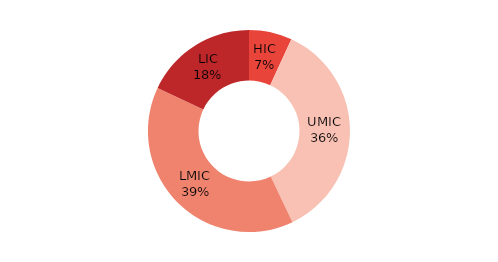
| Category | Series 0 |
|---|---|
| HIC | 4.502 |
| UMIC | 23.545 |
| LMIC | 25.544 |
| LIC | 11.764 |